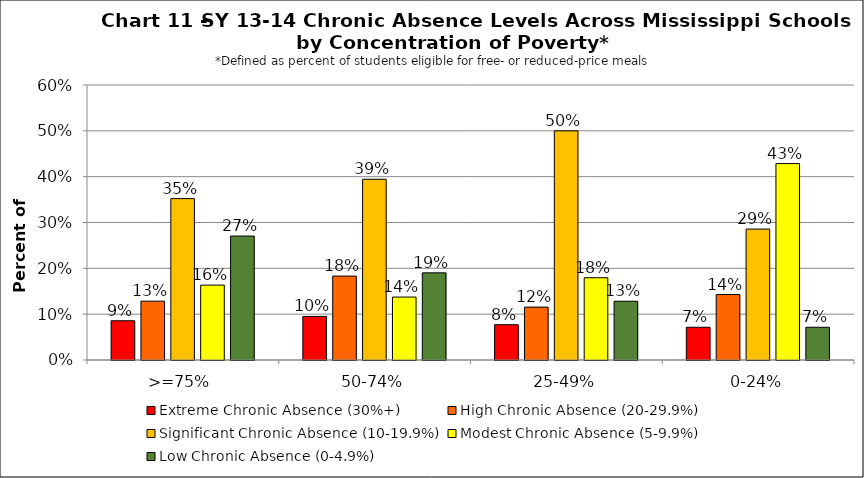
| Category | Extreme Chronic Absence (30%+) | High Chronic Absence (20-29.9%) | Significant Chronic Absence (10-19.9%) | Modest Chronic Absence (5-9.9%) | Low Chronic Absence (0-4.9%) |
|---|---|---|---|---|---|
| 0 | 0.086 | 0.128 | 0.352 | 0.163 | 0.27 |
| 1 | 0.095 | 0.183 | 0.394 | 0.137 | 0.19 |
| 2 | 0.077 | 0.115 | 0.5 | 0.179 | 0.128 |
| 3 | 0.071 | 0.143 | 0.286 | 0.429 | 0.071 |